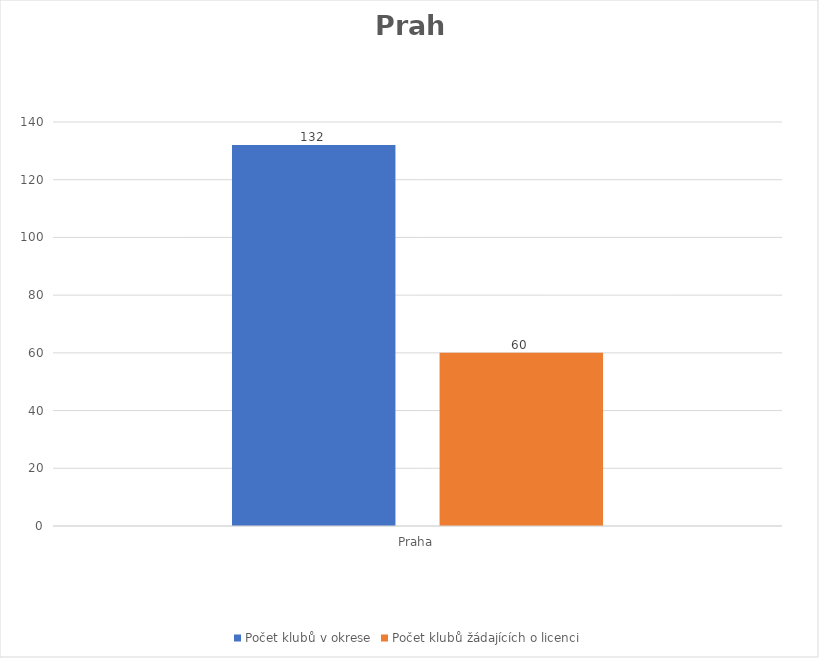
| Category | Počet klubů v okrese | Počet klubů žádajících o licenci |
|---|---|---|
| Praha | 132 | 60 |